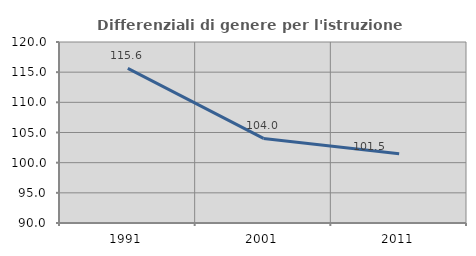
| Category | Differenziali di genere per l'istruzione superiore |
|---|---|
| 1991.0 | 115.639 |
| 2001.0 | 104.013 |
| 2011.0 | 101.481 |